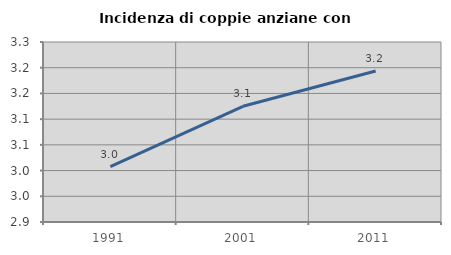
| Category | Incidenza di coppie anziane con figli |
|---|---|
| 1991.0 | 3.008 |
| 2001.0 | 3.125 |
| 2011.0 | 3.194 |